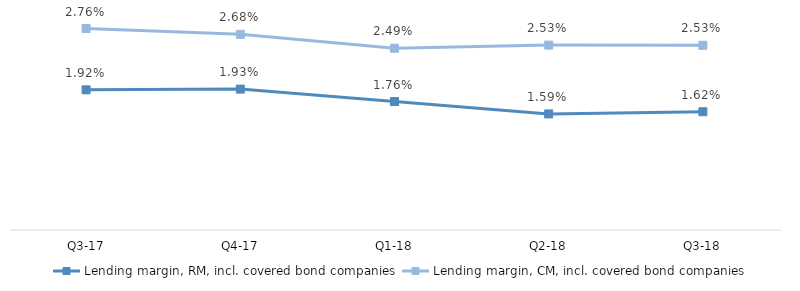
| Category | Lending margin, RM, incl. covered bond companies | Lending margin, CM, incl. covered bond companies |
|---|---|---|
| Q3-18 | 0.016 | 0.025 |
| Q2-18 | 0.016 | 0.025 |
| Q1-18 | 0.018 | 0.025 |
| Q4-17 | 0.019 | 0.027 |
| Q3-17 | 0.019 | 0.028 |